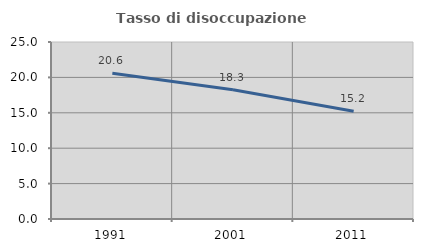
| Category | Tasso di disoccupazione giovanile  |
|---|---|
| 1991.0 | 20.588 |
| 2001.0 | 18.251 |
| 2011.0 | 15.217 |